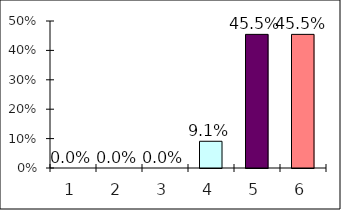
| Category | Series 0 |
|---|---|
| 0 | 0 |
| 1 | 0 |
| 2 | 0 |
| 3 | 0.091 |
| 4 | 0.455 |
| 5 | 0.455 |